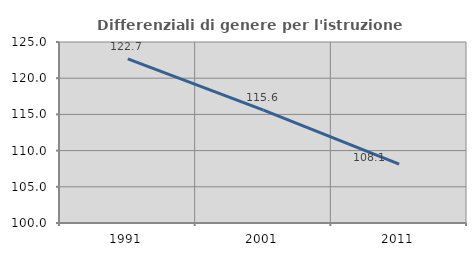
| Category | Differenziali di genere per l'istruzione superiore |
|---|---|
| 1991.0 | 122.664 |
| 2001.0 | 115.602 |
| 2011.0 | 108.12 |